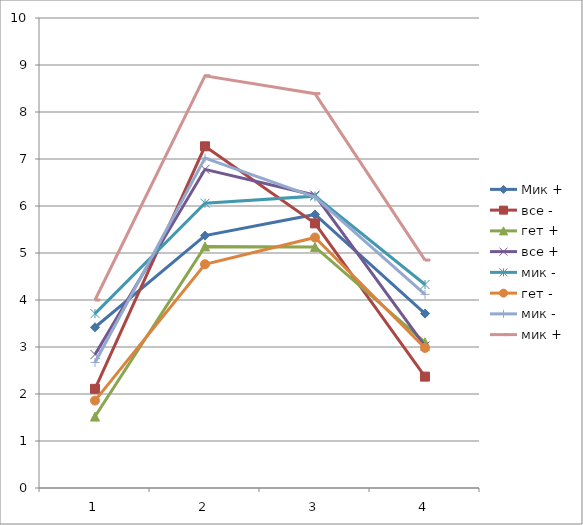
| Category | Мик + | все - | гет + | все + | мик - | гет - | мик + |
|---|---|---|---|---|---|---|---|
| 0 | 3.42 | 2.11 | 1.52 | 2.84 | 2.67 | 1.86 | 4 |
| 1 | 5.37 | 7.27 | 5.14 | 6.78 | 7.02 | 4.76 | 8.77 |
| 2 | 5.82 | 5.63 | 5.13 | 6.23 | 6.19 | 5.33 | 8.39 |
| 3 | 3.71 | 2.37 | 3.1 | 3.02 | 4.12 | 2.98 | 4.85 |